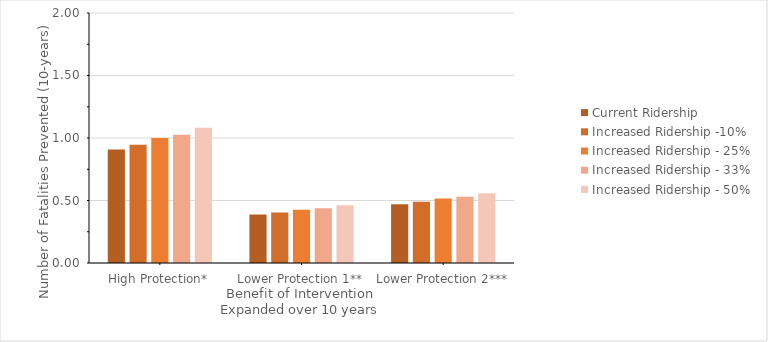
| Category | Current Ridership | Increased Ridership -10% | Increased Ridership - 25% | Increased Ridership - 33% | Increased Ridership - 50% |
|---|---|---|---|---|---|
| High Protection* | 0.908 | 0.946 | 1 | 1.027 | 1.081 |
| Lower Protection 1** | 0.388 | 0.404 | 0.427 | 0.438 | 0.462 |
| Lower Protection 2*** | 0.469 | 0.489 | 0.517 | 0.531 | 0.559 |